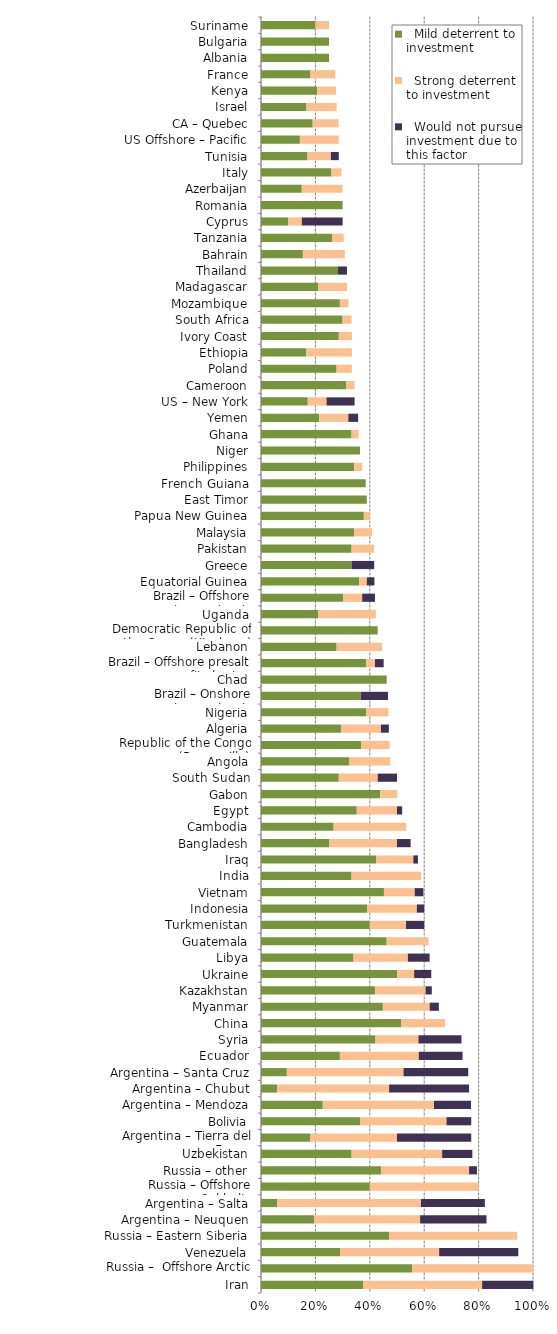
| Category |   Mild deterrent to investment |   Strong deterrent to investment |   Would not pursue investment due to this factor |
|---|---|---|---|
| Iran | 0.375 | 0.438 | 0.188 |
| Russia –  Offshore Arctic | 0.556 | 0.444 | 0 |
| Venezuela | 0.291 | 0.364 | 0.291 |
| Russia – Eastern Siberia | 0.471 | 0.471 | 0 |
| Argentina – Neuquen | 0.195 | 0.39 | 0.244 |
| Argentina – Salta | 0.059 | 0.529 | 0.235 |
| Russia – Offshore Sakhalin | 0.4 | 0.4 | 0 |
| Russia – other | 0.441 | 0.324 | 0.029 |
| Uzbekistan | 0.333 | 0.333 | 0.111 |
| Argentina – Tierra del Fuego | 0.182 | 0.318 | 0.273 |
| Bolivia | 0.364 | 0.318 | 0.091 |
| Argentina – Mendoza | 0.227 | 0.409 | 0.136 |
| Argentina – Chubut | 0.059 | 0.412 | 0.294 |
| Argentina – Santa Cruz | 0.095 | 0.429 | 0.238 |
| Ecuador | 0.29 | 0.29 | 0.161 |
| Syria | 0.421 | 0.158 | 0.158 |
| China | 0.516 | 0.161 | 0 |
| Myanmar | 0.448 | 0.172 | 0.034 |
| Kazakhstan | 0.419 | 0.186 | 0.023 |
| Ukraine | 0.5 | 0.063 | 0.063 |
| Libya | 0.34 | 0.2 | 0.08 |
| Guatemala | 0.462 | 0.154 | 0 |
| Turkmenistan | 0.4 | 0.133 | 0.067 |
| Indonesia | 0.391 | 0.182 | 0.027 |
| Vietnam | 0.452 | 0.113 | 0.032 |
| India | 0.333 | 0.256 | 0 |
| Iraq | 0.424 | 0.136 | 0.017 |
| Bangladesh | 0.25 | 0.25 | 0.05 |
| Cambodia | 0.267 | 0.267 | 0 |
| Egypt | 0.352 | 0.148 | 0.019 |
| Gabon | 0.438 | 0.063 | 0 |
| South Sudan | 0.286 | 0.143 | 0.071 |
| Angola | 0.325 | 0.15 | 0 |
| Republic of the Congo (Brazzaville) | 0.368 | 0.105 | 0 |
| Algeria | 0.294 | 0.147 | 0.029 |
| Nigeria | 0.387 | 0.081 | 0 |
| Brazil – Onshore concession contracts | 0.367 | 0 | 0.1 |
| Chad | 0.462 | 0 | 0 |
| Brazil – Offshore presalt area profit sharing contracts | 0.387 | 0.032 | 0.032 |
| Lebanon | 0.278 | 0.167 | 0 |
| Democratic Republic of the Congo (Kinshasa) | 0.429 | 0 | 0 |
| Uganda | 0.211 | 0.211 | 0 |
| Brazil – Offshore concession contracts | 0.302 | 0.07 | 0.047 |
| Equatorial Guinea | 0.361 | 0.028 | 0.028 |
| Greece | 0.333 | 0 | 0.083 |
| Pakistan | 0.333 | 0.083 | 0 |
| Malaysia | 0.342 | 0.066 | 0 |
| Papua New Guinea | 0.378 | 0.022 | 0 |
| East Timor | 0.389 | 0 | 0 |
| French Guiana | 0.385 | 0 | 0 |
| Philippines | 0.343 | 0.029 | 0 |
| Niger | 0.364 | 0 | 0 |
| Ghana | 0.333 | 0.026 | 0 |
| Yemen | 0.214 | 0.107 | 0.036 |
| US – New York | 0.172 | 0.069 | 0.103 |
| Cameroon | 0.313 | 0.031 | 0 |
| Poland | 0.278 | 0.056 | 0 |
| Ethiopia | 0.167 | 0.167 | 0 |
| Ivory Coast | 0.286 | 0.048 | 0 |
| South Africa | 0.3 | 0.033 | 0 |
| Mozambique | 0.29 | 0.032 | 0 |
| Madagascar | 0.211 | 0.105 | 0 |
| Thailand | 0.283 | 0 | 0.033 |
| Bahrain | 0.154 | 0.154 | 0 |
| Tanzania | 0.261 | 0.043 | 0 |
| Cyprus | 0.1 | 0.05 | 0.15 |
| Romania | 0.3 | 0 | 0 |
| Azerbaijan | 0.15 | 0.15 | 0 |
| Italy | 0.259 | 0.037 | 0 |
| Tunisia | 0.171 | 0.086 | 0.029 |
| US Offshore – Pacific | 0.143 | 0.143 | 0 |
| CA – Quebec | 0.19 | 0.095 | 0 |
| Israel | 0.167 | 0.111 | 0 |
| Kenya | 0.207 | 0.069 | 0 |
| France | 0.182 | 0.091 | 0 |
| Albania | 0.25 | 0 | 0 |
| Bulgaria | 0.25 | 0 | 0 |
| Suriname | 0.2 | 0.05 | 0 |